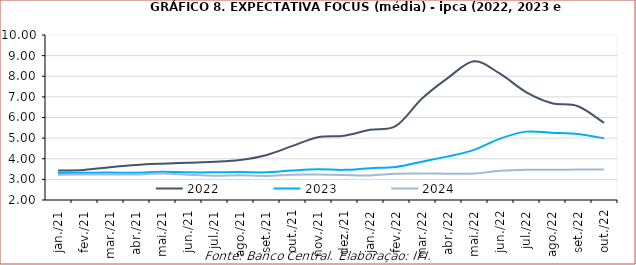
| Category | 2022 | 2023 | 2024 |
|---|---|---|---|
| 2021-01-01 | 3.43 | 3.31 | 3.23 |
| 2021-02-01 | 3.46 | 3.32 | 3.24 |
| 2021-03-01 | 3.59 | 3.328 | 3.232 |
| 2021-04-01 | 3.7 | 3.32 | 3.238 |
| 2021-05-01 | 3.764 | 3.371 | 3.282 |
| 2021-06-01 | 3.81 | 3.34 | 3.23 |
| 2021-07-01 | 3.856 | 3.34 | 3.179 |
| 2021-08-01 | 3.943 | 3.353 | 3.199 |
| 2021-09-01 | 4.174 | 3.342 | 3.167 |
| 2021-10-01 | 4.611 | 3.426 | 3.228 |
| 2021-11-01 | 5.044 | 3.486 | 3.236 |
| 2021-12-01 | 5.118 | 3.461 | 3.207 |
| 2022-01-01 | 5.404 | 3.543 | 3.192 |
| 2022-02-01 | 5.594 | 3.604 | 3.271 |
| 2022-03-01 | 6.918 | 3.858 | 3.28 |
| 2022-04-01 | 7.921 | 4.114 | 3.278 |
| 2022-05-01 | 8.728 | 4.432 | 3.283 |
| 2022-06-01 | 8.124 | 4.974 | 3.413 |
| 2022-07-01 | 7.236 | 5.315 | 3.468 |
| 2022-08-01 | 6.695 | 5.258 | 3.461 |
| 2022-09-01 | 6.544 | 5.2 | 3.476 |
| 2022-10-01 | 5.739 | 4.993 | 3.48 |